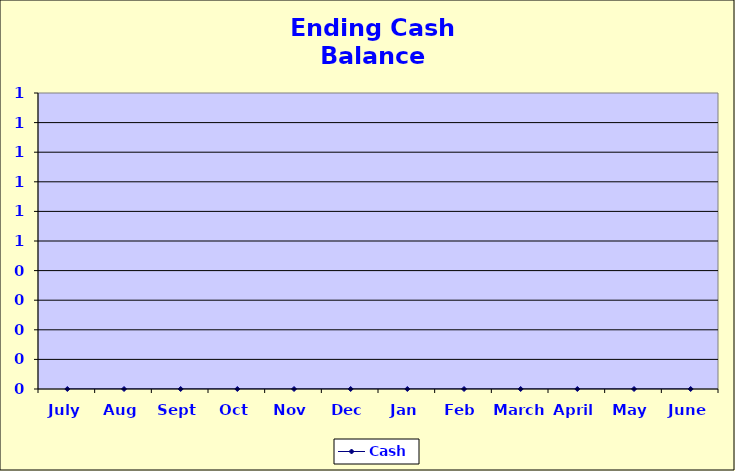
| Category | Cash  |
|---|---|
| July | 0 |
| Aug | 0 |
| Sept | 0 |
| Oct | 0 |
| Nov | 0 |
| Dec | 0 |
| Jan | 0 |
| Feb | 0 |
| March | 0 |
| April | 0 |
| May | 0 |
| June | 0 |